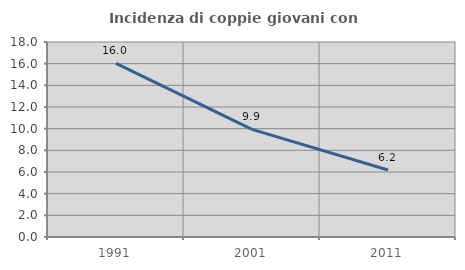
| Category | Incidenza di coppie giovani con figli |
|---|---|
| 1991.0 | 16.019 |
| 2001.0 | 9.93 |
| 2011.0 | 6.188 |